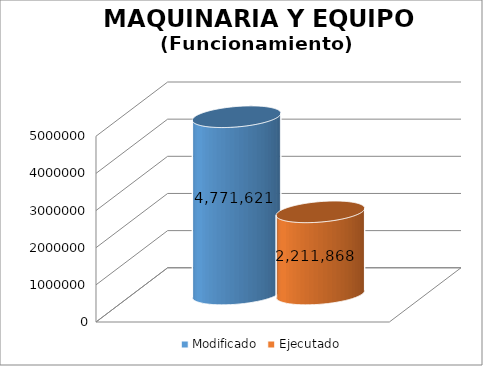
| Category | Modificado | Ejecutado |
|---|---|---|
| 0 | 4771621 | 2211868.02 |